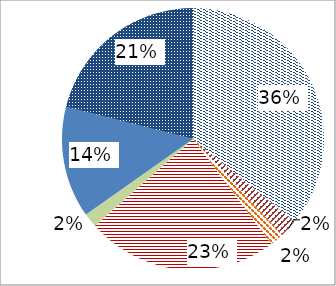
| Category | Series 0 |
|---|---|
| Fixed-line phone | 23321804421 |
| Cable Modem | 1419746955 |
| DSL | 1112142409 |
| FTTH/B | 0 |
| OtherInternet/unidntf. | 15381923139 |
| 1Gmobile analog voice | 1139079171 |
| 2 G mobile voice | 8931938451 |
| 2.5G mobile voice | 0 |
| 3G mobile voice | 0 |
| 2G mobile data | 13659753516 |
| 2.5G mobile data | 0 |
| 3G mobile data | 0 |